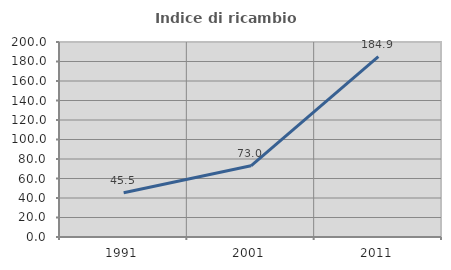
| Category | Indice di ricambio occupazionale  |
|---|---|
| 1991.0 | 45.455 |
| 2001.0 | 73.016 |
| 2011.0 | 184.906 |